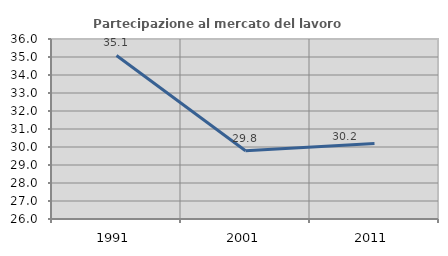
| Category | Partecipazione al mercato del lavoro  femminile |
|---|---|
| 1991.0 | 35.088 |
| 2001.0 | 29.787 |
| 2011.0 | 30.189 |